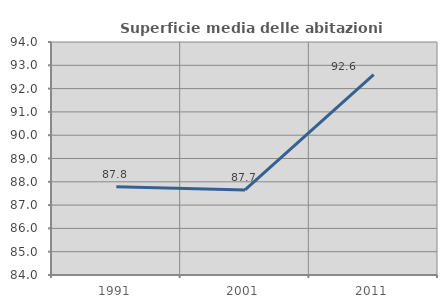
| Category | Superficie media delle abitazioni occupate |
|---|---|
| 1991.0 | 87.788 |
| 2001.0 | 87.651 |
| 2011.0 | 92.602 |